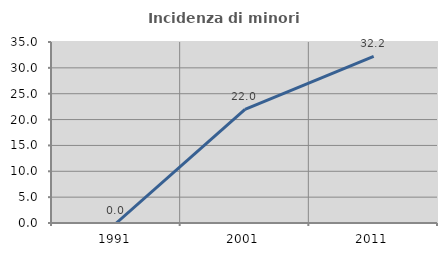
| Category | Incidenza di minori stranieri |
|---|---|
| 1991.0 | 0 |
| 2001.0 | 21.951 |
| 2011.0 | 32.222 |